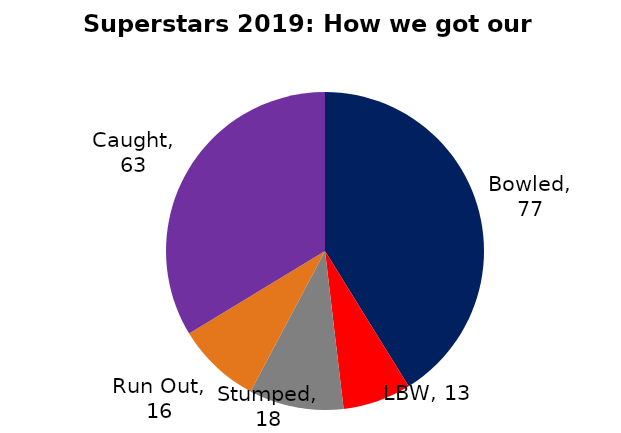
| Category | BOWLING |
|---|---|
| Bowled | 77 |
| LBW | 13 |
| Stumped | 18 |
| Run Out | 16 |
| Caught | 63 |